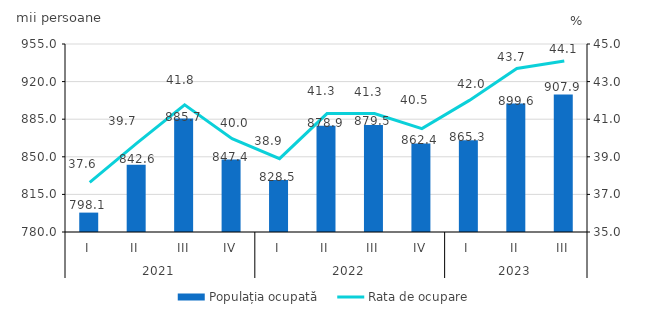
| Category | Populația ocupată |
|---|---|
| 0 | 798.054 |
| 1 | 842.611 |
| 2 | 885.715 |
| 3 | 847.401 |
| 4 | 828.5 |
| 5 | 878.9 |
| 6 | 879.5 |
| 7 | 862.4 |
| 8 | 865.3 |
| 9 | 899.6 |
| 10 | 907.9 |